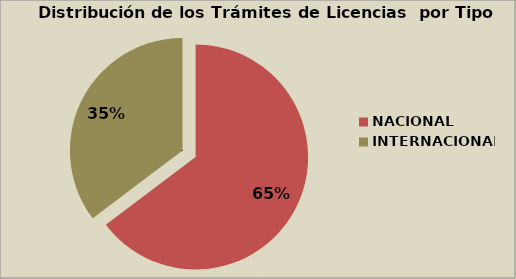
| Category | Series 0 |
|---|---|
| NACIONAL | 64.7 |
| INTERNACIONAL | 35.3 |